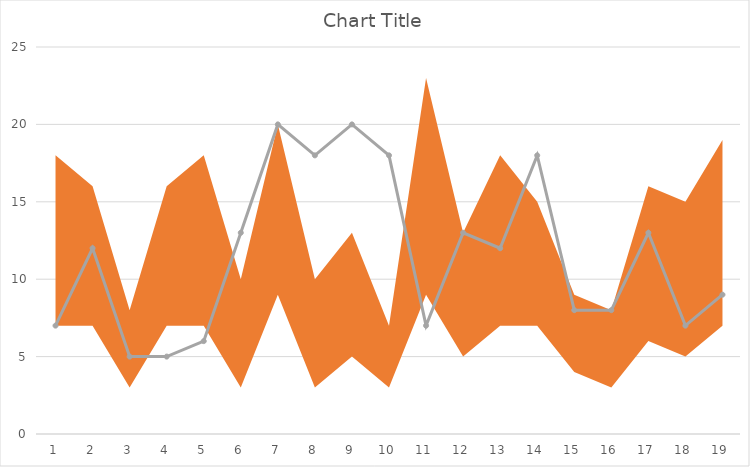
| Category | hodnota |
|---|---|
| 0 | 7 |
| 1 | 12 |
| 2 | 5 |
| 3 | 5 |
| 4 | 6 |
| 5 | 13 |
| 6 | 20 |
| 7 | 18 |
| 8 | 20 |
| 9 | 18 |
| 10 | 7 |
| 11 | 13 |
| 12 | 12 |
| 13 | 18 |
| 14 | 8 |
| 15 | 8 |
| 16 | 13 |
| 17 | 7 |
| 18 | 9 |